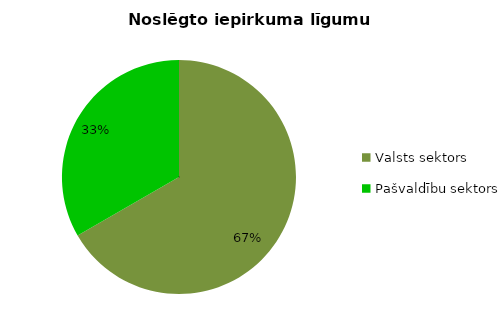
| Category | Noslēgto iepirkuma līgumu skaits |
|---|---|
| Valsts sektors | 7612 |
| Pašvaldību sektors | 3803 |